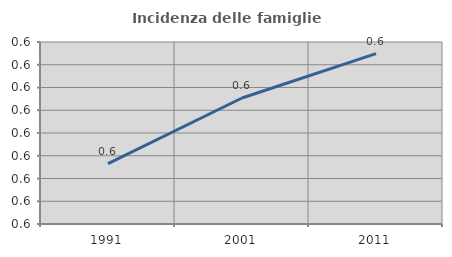
| Category | Incidenza delle famiglie numerose |
|---|---|
| 1991.0 | 0.587 |
| 2001.0 | 0.615 |
| 2011.0 | 0.635 |